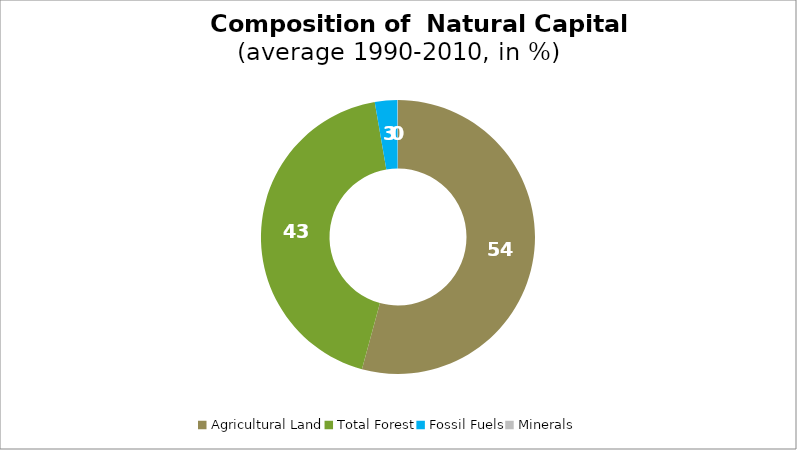
| Category | Series 0 |
|---|---|
| Agricultural Land | 54.243 |
| Total Forest | 43.039 |
| Fossil Fuels | 2.661 |
| Minerals | 0.058 |